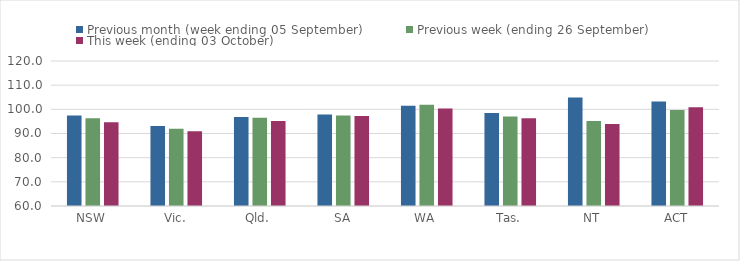
| Category | Previous month (week ending 05 September) | Previous week (ending 26 September) | This week (ending 03 October) |
|---|---|---|---|
| NSW | 97.41 | 96.29 | 94.67 |
| Vic. | 93.13 | 91.98 | 90.98 |
| Qld. | 96.83 | 96.5 | 95.18 |
| SA | 97.88 | 97.4 | 97.28 |
| WA | 101.46 | 101.91 | 100.35 |
| Tas. | 98.45 | 97.07 | 96.34 |
| NT | 104.87 | 95.17 | 93.91 |
| ACT | 103.22 | 99.74 | 100.89 |